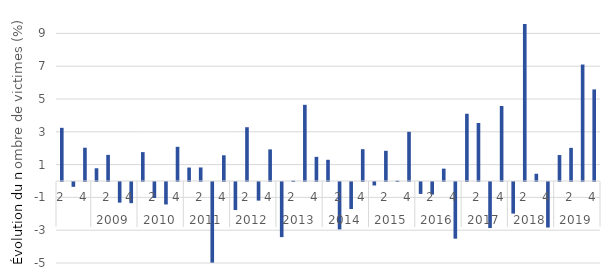
| Category | évolution trimestrielle (%) |
|---|---|
| 0 | 3.243 |
| 1 | -0.294 |
| 2 | 2.029 |
| 3 | 0.776 |
| 4 | 1.594 |
| 5 | -1.258 |
| 6 | -1.289 |
| 7 | 1.761 |
| 8 | -0.973 |
| 9 | -1.37 |
| 10 | 2.085 |
| 11 | 0.82 |
| 12 | 0.827 |
| 13 | -4.914 |
| 14 | 1.569 |
| 15 | -1.71 |
| 16 | 3.279 |
| 17 | -1.136 |
| 18 | 1.927 |
| 19 | -3.362 |
| 20 | 0.022 |
| 21 | 4.646 |
| 22 | 1.473 |
| 23 | 1.293 |
| 24 | -2.889 |
| 25 | -1.646 |
| 26 | 1.94 |
| 27 | -0.212 |
| 28 | 1.841 |
| 29 | 0.019 |
| 30 | 2.998 |
| 31 | -0.726 |
| 32 | -0.763 |
| 33 | 0.754 |
| 34 | -3.454 |
| 35 | 4.1 |
| 36 | 3.536 |
| 37 | -2.807 |
| 38 | 4.575 |
| 39 | -1.926 |
| 40 | 9.575 |
| 41 | 0.441 |
| 42 | -2.774 |
| 43 | 1.583 |
| 44 | 2.021 |
| 45 | 7.102 |
| 46 | 5.585 |